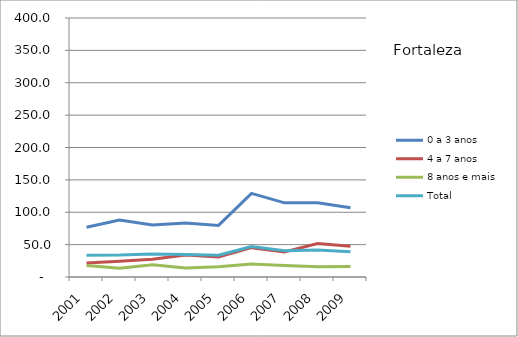
| Category | 0 a 3 anos | 4 a 7 anos | 8 anos e mais | Total |
|---|---|---|---|---|
| 2001.0 | 76.8 | 21.7 | 17.7 | 33.7 |
| 2002.0 | 88 | 24.3 | 13.4 | 33.9 |
| 2003.0 | 80.2 | 27.5 | 19 | 35.5 |
| 2004.0 | 83.4 | 34 | 14 | 34.7 |
| 2005.0 | 79.7 | 31 | 15.9 | 33.5 |
| 2006.0 | 129.2 | 45.3 | 19.9 | 47 |
| 2007.0 | 114.5 | 38.8 | 17.6 | 40.7 |
| 2008.0 | 114.5 | 51.8 | 16 | 41.7 |
| 2009.0 | 106.9 | 47.4 | 16.2 | 39 |